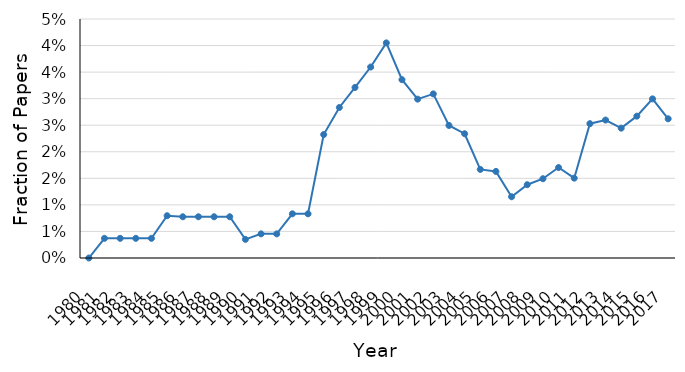
| Category | Elasticity of Taxable Income |
|---|---|
| 1980.0 | 0 |
| 1981.0 | 0.004 |
| 1982.0 | 0.004 |
| 1983.0 | 0.004 |
| 1984.0 | 0.004 |
| 1985.0 | 0.008 |
| 1986.0 | 0.008 |
| 1987.0 | 0.008 |
| 1988.0 | 0.008 |
| 1989.0 | 0.008 |
| 1990.0 | 0.004 |
| 1991.0 | 0.005 |
| 1992.0 | 0.005 |
| 1993.0 | 0.008 |
| 1994.0 | 0.008 |
| 1995.0 | 0.023 |
| 1996.0 | 0.028 |
| 1997.0 | 0.032 |
| 1998.0 | 0.036 |
| 1999.0 | 0.041 |
| 2000.0 | 0.034 |
| 2001.0 | 0.03 |
| 2002.0 | 0.031 |
| 2003.0 | 0.025 |
| 2004.0 | 0.023 |
| 2005.0 | 0.017 |
| 2006.0 | 0.016 |
| 2007.0 | 0.012 |
| 2008.0 | 0.014 |
| 2009.0 | 0.015 |
| 2010.0 | 0.017 |
| 2011.0 | 0.015 |
| 2012.0 | 0.025 |
| 2013.0 | 0.026 |
| 2014.0 | 0.024 |
| 2015.0 | 0.027 |
| 2016.0 | 0.03 |
| 2017.0 | 0.026 |